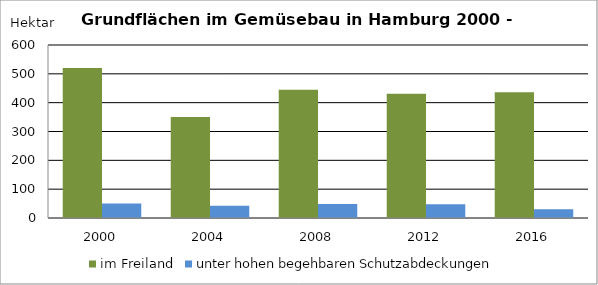
| Category | im Freiland | unter hohen begehbaren Schutzabdeckungen |
|---|---|---|
| 2000.0 | 520.2 | 50.7 |
| 2004.0 | 350.5 | 42.5 |
| 2008.0 | 444.4 | 48.3 |
| 2012.0 | 430.7 | 47.5 |
| 2016.0 | 435.7 | 30.2 |